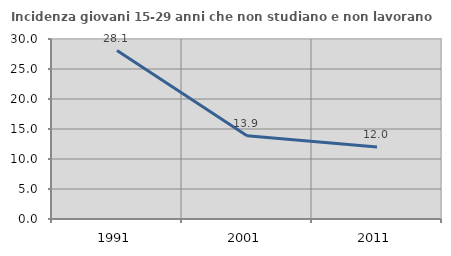
| Category | Incidenza giovani 15-29 anni che non studiano e non lavorano  |
|---|---|
| 1991.0 | 28.07 |
| 2001.0 | 13.889 |
| 2011.0 | 12 |